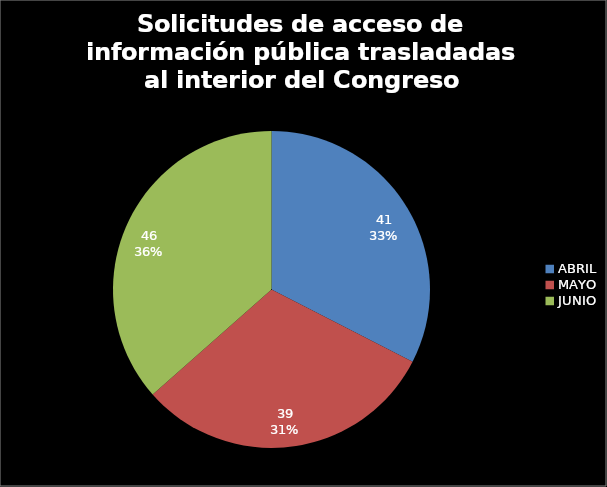
| Category | Solicitudes de acceso de información pública trasladadas al interior del Congreso |
|---|---|
| ABRIL | 41 |
| MAYO | 39 |
| JUNIO | 46 |